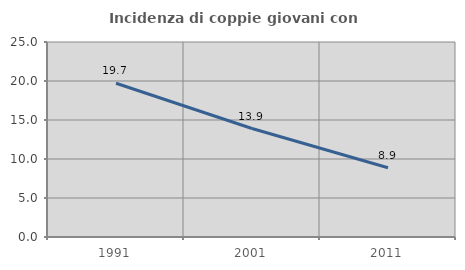
| Category | Incidenza di coppie giovani con figli |
|---|---|
| 1991.0 | 19.71 |
| 2001.0 | 13.906 |
| 2011.0 | 8.88 |